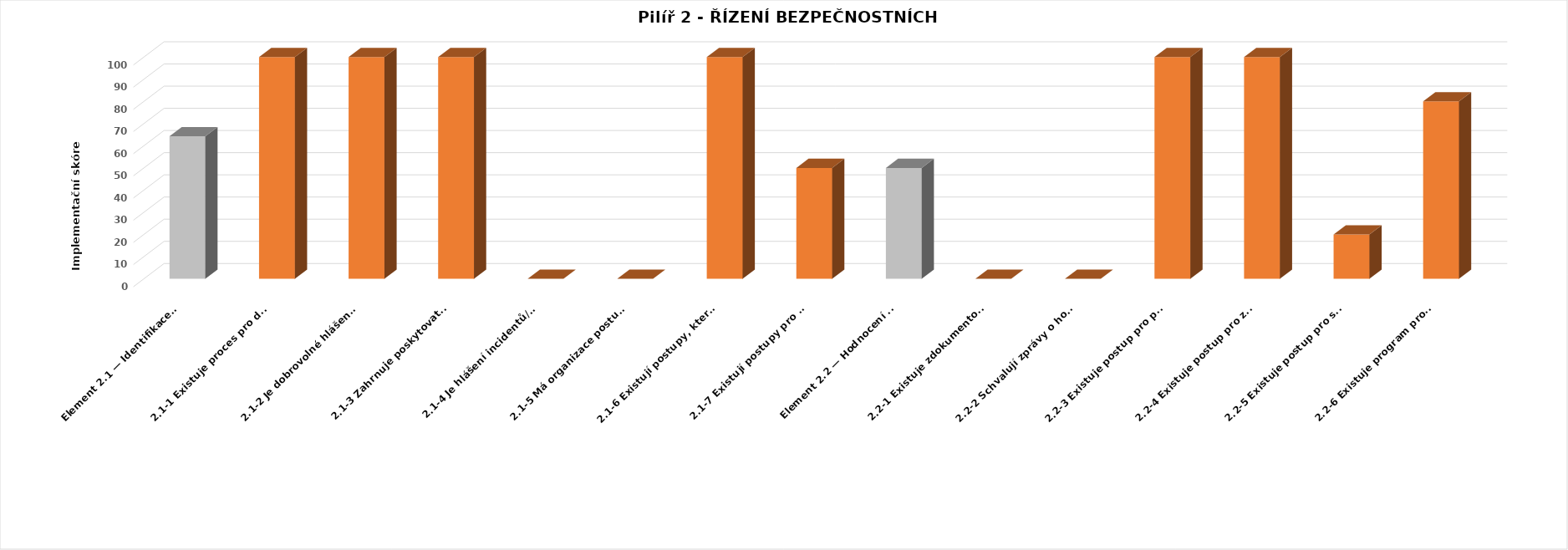
| Category | Series 0 |
|---|---|
| Element 2.1 — Identifikace rizika | 64.286 |
| 2.1-1 Existuje proces pro dobrovolné hlášení nebezpečí/hrozeb všemi zaměstnanci? | 100 |
| 2.1-2 Je dobrovolné hlášení nebezpečí/hrozeb jednoduché, dostupné všem pracovníkům zapojeným do povinností souvisejících s bezpečností a úměrné velikosti poskytovatele služeb? | 100 |
| 2.1-3 Zahrnuje poskytovatel služeb SDCPS postupy pro hlášení incidentů/nehod ze strany provozního nebo výrobního personálu? | 100 |
| 2.1-4 Je hlášení incidentů/nehod jednoduché, přístupné všem pracovníkům zapojeným do povinností souvisejících s bezpečností a úměrné velikosti poskytovatele služeb? | 0 |
| 2.1-5 Má organizace postupy pro vyšetřování všech hlášených incidentů/nehod? | 0 |
| 2.1-6 Existují postupy, které zajistí, že nebezpečí/hrozby identifikované nebo odhalené během procesů vyšetřování incidentů/nehod jsou náležitě zohledněny a začleněny do postupu organizace shromažďování nebezpečí a zmírňování rizik? | 100 |
| 2.1-7 Existují postupy pro přezkoumání nebezpečí/hrozeb z příslušných průmyslových zpráv pro následná opatření nebo případně hodnocení rizik? | 50 |
| Element 2.2 — Hodnocení a zmírňování bezpečnostních rizik | 50 |
| 2.2-1 Existuje zdokumentovaný postup identifikace nebezpečí a zmírňování rizik (HIRM) zahrnující použití nástrojů objektivní analýzy rizik? | 0 |
| 2.2-2 Schvalují zprávy o hodnocení rizik vedoucí oddělení nebo případně na vyšší úrovni? | 0 |
| 2.2-3 Existuje postup pro pravidelnou kontrolu stávajících záznamů o zmírňování rizik? | 100 |
| 2.2-4 Existuje postup pro zohlednění opatření ke zmírnění, kdykoli jsou identifikovány nepřijatelné úrovně rizika? | 100 |
| 2.2-5 Existuje postup pro stanovení priority identifikovaných nebezpečí pro opatření ke zmírnění rizik? | 20 |
| 2.2-6 Existuje program pro systematické a postupné přezkoumání všech operací, procesů, zařízení a vybavení souvisejících s bezpečností letectví, které podléhají procesu HIRM, jak je identifikuje poskytovatel služeb? | 80 |